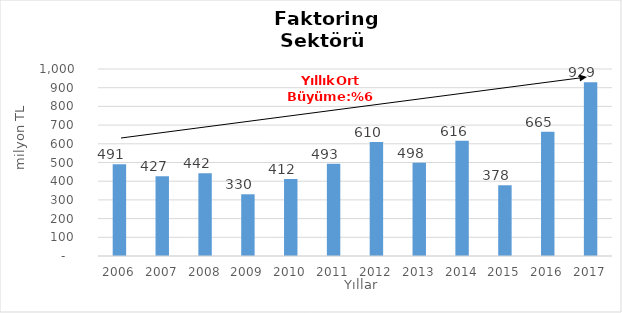
| Category | Faktoring  |
|---|---|
| 2006.0 | 490.834 |
| 2007.0 | 426.554 |
| 2008.0 | 442.315 |
| 2009.0 | 330.082 |
| 2010.0 | 412.077 |
| 2011.0 | 492.71 |
| 2012.0 | 610.081 |
| 2013.0 | 498.446 |
| 2014.0 | 616 |
| 2015.0 | 378 |
| 2016.0 | 665 |
| 2017.0 | 929 |